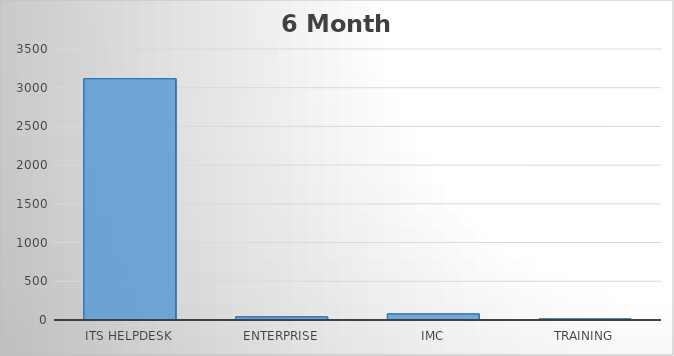
| Category | 6M Closed |
|---|---|
| 0 | 3116 |
| 1 | 39 |
| 2 | 77 |
| 3 | 13 |